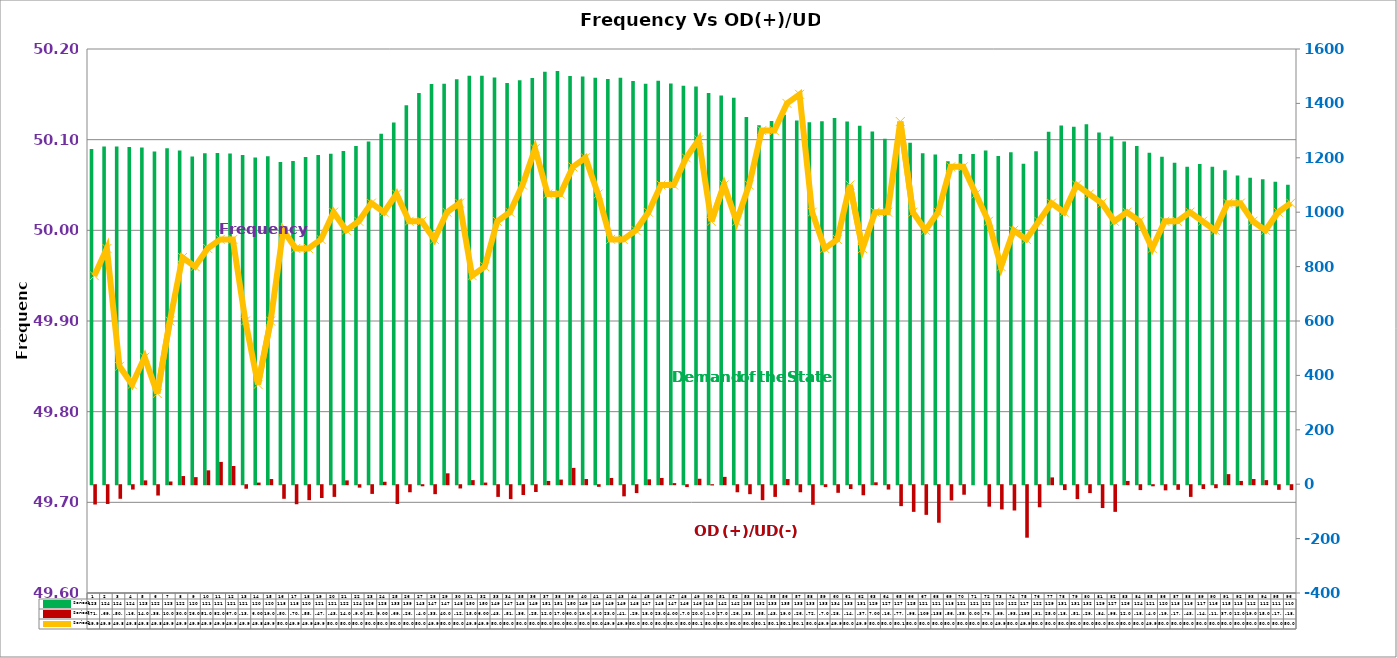
| Category | Series 2 | Series 4 |
|---|---|---|
| 0 | 1232 | -71 |
| 1 | 1242 | -69 |
| 2 | 1242 | -50 |
| 3 | 1240 | -16 |
| 4 | 1238 | 14 |
| 5 | 1223 | -38 |
| 6 | 1235 | 10 |
| 7 | 1227 | 30 |
| 8 | 1205 | 26 |
| 9 | 1217 | 51 |
| 10 | 1218 | 82 |
| 11 | 1216 | 67 |
| 12 | 1210 | -13 |
| 13 | 1201 | 6 |
| 14 | 1206 | 19 |
| 15 | 1185 | -50 |
| 16 | 1188 | -70 |
| 17 | 1203 | -55 |
| 18 | 1210 | -47 |
| 19 | 1215 | -43 |
| 20 | 1225 | 14 |
| 21 | 1243 | -9 |
| 22 | 1260 | -32 |
| 23 | 1288 | 9 |
| 24 | 1330 | -69 |
| 25 | 1393 | -26 |
| 26 | 1438 | -4 |
| 27 | 1471 | -33 |
| 28 | 1472 | 40 |
| 29 | 1489 | -12 |
| 30 | 1502 | 15 |
| 31 | 1502 | 6 |
| 32 | 1495 | -43 |
| 33 | 1475 | -51 |
| 34 | 1485 | -36 |
| 35 | 1493 | -25 |
| 36 | 1516 | 12 |
| 37 | 1519 | 17 |
| 38 | 1501 | 60 |
| 39 | 1499 | 19 |
| 40 | 1494 | -6 |
| 41 | 1490 | 23 |
| 42 | 1494 | -41 |
| 43 | 1482 | -29 |
| 44 | 1472 | 18 |
| 45 | 1483 | 23 |
| 46 | 1473 | 4 |
| 47 | 1465 | -7 |
| 48 | 1462 | 20 |
| 49 | 1438 | -1 |
| 50 | 1429 | 27 |
| 51 | 1421 | -26 |
| 52 | 1350 | -33 |
| 53 | 1320 | -55 |
| 54 | 1335 | -43 |
| 55 | 1358 | 19 |
| 56 | 1337 | -26 |
| 57 | 1331 | -72 |
| 58 | 1334 | -7 |
| 59 | 1346 | -28 |
| 60 | 1333 | -14 |
| 61 | 1318 | -37 |
| 62 | 1297 | 7 |
| 63 | 1270 | -16 |
| 64 | 1274 | -77 |
| 65 | 1255 | -98 |
| 66 | 1217 | -109 |
| 67 | 1212.333 | -138 |
| 68 | 1187 | -56 |
| 69 | 1214 | -35 |
| 70 | 1214 | 0 |
| 71 | 1227 | -79 |
| 72 | 1207 | -89 |
| 73 | 1220 | -93 |
| 74 | 1178 | -193 |
| 75 | 1224 | -81 |
| 76 | 1296 | 25 |
| 77 | 1319 | -18 |
| 78 | 1314 | -51 |
| 79 | 1323 | -29 |
| 80 | 1293 | -84 |
| 81 | 1278 | -98 |
| 82 | 1260 | 12 |
| 83 | 1243 | -18 |
| 84 | 1219 | -4 |
| 85 | 1204 | -19 |
| 86 | 1182 | -17 |
| 87 | 1167 | -43 |
| 88 | 1177 | -14 |
| 89 | 1167 | -11 |
| 90 | 1154 | 37 |
| 91 | 1135 | 12 |
| 92 | 1127 | 19 |
| 93 | 1121 | 15 |
| 94 | 1112 | -17 |
| 95 | 1101 | -18 |